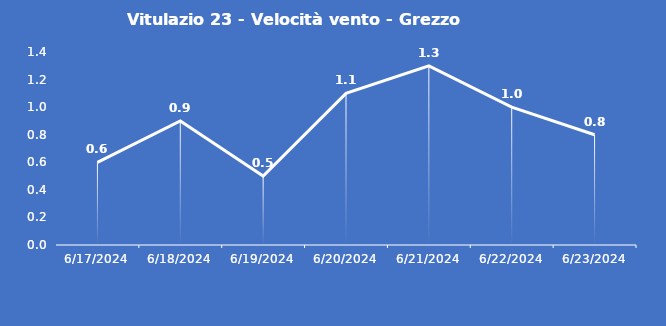
| Category | Vitulazio 23 - Velocità vento - Grezzo (m/s) |
|---|---|
| 6/17/24 | 0.6 |
| 6/18/24 | 0.9 |
| 6/19/24 | 0.5 |
| 6/20/24 | 1.1 |
| 6/21/24 | 1.3 |
| 6/22/24 | 1 |
| 6/23/24 | 0.8 |